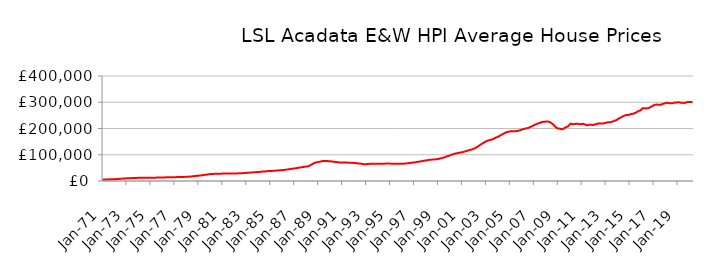
| Category | Series 0 |
|---|---|
| 1971-01-01 | 5721.637 |
| 1971-02-01 | 5762.296 |
| 1971-03-01 | 5803.295 |
| 1971-04-01 | 5856.6 |
| 1971-05-01 | 5945.059 |
| 1971-06-01 | 6037.239 |
| 1971-07-01 | 6150.593 |
| 1971-08-01 | 6273.935 |
| 1971-09-01 | 6396.293 |
| 1971-10-01 | 6523.41 |
| 1971-11-01 | 6660.635 |
| 1971-12-01 | 6827.73 |
| 1972-01-01 | 6943.709 |
| 1972-02-01 | 7019.642 |
| 1972-03-01 | 7192.485 |
| 1972-04-01 | 7434.182 |
| 1972-05-01 | 7783.4 |
| 1972-06-01 | 8089.841 |
| 1972-07-01 | 8442.17 |
| 1972-08-01 | 8782.047 |
| 1972-09-01 | 9082.157 |
| 1972-10-01 | 9362.629 |
| 1972-11-01 | 9622.344 |
| 1972-12-01 | 9890.271 |
| 1973-01-01 | 10081.941 |
| 1973-02-01 | 10217.371 |
| 1973-03-01 | 10373.062 |
| 1973-04-01 | 10550.653 |
| 1973-05-01 | 10778.346 |
| 1973-06-01 | 10926.279 |
| 1973-07-01 | 11081.212 |
| 1973-08-01 | 11253.08 |
| 1973-09-01 | 11453.654 |
| 1973-10-01 | 11661.609 |
| 1973-11-01 | 11820.086 |
| 1973-12-01 | 11933.729 |
| 1974-01-01 | 11994.68 |
| 1974-02-01 | 12060.371 |
| 1974-03-01 | 12057.68 |
| 1974-04-01 | 12031.652 |
| 1974-05-01 | 12008.684 |
| 1974-06-01 | 12009.52 |
| 1974-07-01 | 12021.199 |
| 1974-08-01 | 12060.402 |
| 1974-09-01 | 12131.717 |
| 1974-10-01 | 12219.316 |
| 1974-11-01 | 12291.911 |
| 1974-12-01 | 12363.582 |
| 1975-01-01 | 12396.74 |
| 1975-02-01 | 12438.568 |
| 1975-03-01 | 12512.8 |
| 1975-04-01 | 12618.502 |
| 1975-05-01 | 12746.827 |
| 1975-06-01 | 12815.529 |
| 1975-07-01 | 12882.897 |
| 1975-08-01 | 12975.913 |
| 1975-09-01 | 13101.794 |
| 1975-10-01 | 13241.651 |
| 1975-11-01 | 13364.792 |
| 1975-12-01 | 13496.487 |
| 1976-01-01 | 13589.21 |
| 1976-02-01 | 13676.529 |
| 1976-03-01 | 13736.277 |
| 1976-04-01 | 13799.828 |
| 1976-05-01 | 13882.974 |
| 1976-06-01 | 13937.373 |
| 1976-07-01 | 13997.548 |
| 1976-08-01 | 14086.604 |
| 1976-09-01 | 14214.053 |
| 1976-10-01 | 14357.689 |
| 1976-11-01 | 14472.621 |
| 1976-12-01 | 14575.256 |
| 1977-01-01 | 14632.325 |
| 1977-02-01 | 14697.865 |
| 1977-03-01 | 14740.363 |
| 1977-04-01 | 14790.21 |
| 1977-05-01 | 14867.201 |
| 1977-06-01 | 14937.016 |
| 1977-07-01 | 15022.857 |
| 1977-08-01 | 15140.588 |
| 1977-09-01 | 15284.567 |
| 1977-10-01 | 15446.76 |
| 1977-11-01 | 15618.347 |
| 1977-12-01 | 15842.314 |
| 1978-01-01 | 16008.634 |
| 1978-02-01 | 16138.444 |
| 1978-03-01 | 16313.376 |
| 1978-04-01 | 16548.702 |
| 1978-05-01 | 16925.958 |
| 1978-06-01 | 17307.721 |
| 1978-07-01 | 17769.442 |
| 1978-08-01 | 18243.045 |
| 1978-09-01 | 18698.842 |
| 1978-10-01 | 19152.07 |
| 1978-11-01 | 19574.7 |
| 1978-12-01 | 19992.283 |
| 1979-01-01 | 20240.686 |
| 1979-02-01 | 20407.294 |
| 1979-03-01 | 20822.308 |
| 1979-04-01 | 21391.186 |
| 1979-05-01 | 22117.161 |
| 1979-06-01 | 22577.858 |
| 1979-07-01 | 23056.032 |
| 1979-08-01 | 23594.497 |
| 1979-09-01 | 24239.606 |
| 1979-10-01 | 24928.227 |
| 1979-11-01 | 25501.578 |
| 1979-12-01 | 25947.078 |
| 1980-01-01 | 26191.666 |
| 1980-02-01 | 26381.777 |
| 1980-03-01 | 26625.705 |
| 1980-04-01 | 26911.328 |
| 1980-05-01 | 27245.442 |
| 1980-06-01 | 27424.169 |
| 1980-07-01 | 27586.236 |
| 1980-08-01 | 27736.009 |
| 1980-09-01 | 27841.614 |
| 1980-10-01 | 27909.24 |
| 1980-11-01 | 27961.216 |
| 1980-12-01 | 28071.794 |
| 1981-01-01 | 28137.528 |
| 1981-02-01 | 28237.242 |
| 1981-03-01 | 28337.226 |
| 1981-04-01 | 28471.422 |
| 1981-05-01 | 28607.481 |
| 1981-06-01 | 28653.642 |
| 1981-07-01 | 28675.655 |
| 1981-08-01 | 28681.095 |
| 1981-09-01 | 28627.074 |
| 1981-10-01 | 28528.492 |
| 1981-11-01 | 28437.987 |
| 1981-12-01 | 28428.134 |
| 1982-01-01 | 28384.207 |
| 1982-02-01 | 28403.446 |
| 1982-03-01 | 28560.962 |
| 1982-04-01 | 28826.348 |
| 1982-05-01 | 29123.624 |
| 1982-06-01 | 29232.109 |
| 1982-07-01 | 29313.958 |
| 1982-08-01 | 29470.039 |
| 1982-09-01 | 29723.125 |
| 1982-10-01 | 30023.812 |
| 1982-11-01 | 30323.377 |
| 1982-12-01 | 30694.881 |
| 1983-01-01 | 30977.174 |
| 1983-02-01 | 31219.783 |
| 1983-03-01 | 31472.577 |
| 1983-04-01 | 31785.86 |
| 1983-05-01 | 32196.746 |
| 1983-06-01 | 32519.187 |
| 1983-07-01 | 32870.27 |
| 1983-08-01 | 33203.815 |
| 1983-09-01 | 33470.441 |
| 1983-10-01 | 33688.574 |
| 1983-11-01 | 33894.414 |
| 1983-12-01 | 34164.762 |
| 1984-01-01 | 34326.341 |
| 1984-02-01 | 34490.39 |
| 1984-03-01 | 34801.858 |
| 1984-04-01 | 35233.922 |
| 1984-05-01 | 35728.512 |
| 1984-06-01 | 35947.792 |
| 1984-07-01 | 36131.309 |
| 1984-08-01 | 36410.916 |
| 1984-09-01 | 36857.095 |
| 1984-10-01 | 37373.309 |
| 1984-11-01 | 37772.28 |
| 1984-12-01 | 38049.568 |
| 1985-01-01 | 38126.541 |
| 1985-02-01 | 38232.92 |
| 1985-03-01 | 38494.448 |
| 1985-04-01 | 38861.795 |
| 1985-05-01 | 39281.243 |
| 1985-06-01 | 39443.336 |
| 1985-07-01 | 39593.189 |
| 1985-08-01 | 39852.962 |
| 1985-09-01 | 40286.193 |
| 1985-10-01 | 40780.974 |
| 1985-11-01 | 41196.83 |
| 1985-12-01 | 41529.429 |
| 1986-01-01 | 41658.708 |
| 1986-02-01 | 41790.707 |
| 1986-03-01 | 42176.28 |
| 1986-04-01 | 42734.024 |
| 1986-05-01 | 43430.153 |
| 1986-06-01 | 43851.604 |
| 1986-07-01 | 44282.443 |
| 1986-08-01 | 44796.764 |
| 1986-09-01 | 45443.204 |
| 1986-10-01 | 46141.317 |
| 1986-11-01 | 46774.998 |
| 1986-12-01 | 47365.819 |
| 1987-01-01 | 47708.6 |
| 1987-02-01 | 47992.425 |
| 1987-03-01 | 48608.074 |
| 1987-04-01 | 49436.983 |
| 1987-05-01 | 50427.396 |
| 1987-06-01 | 50986.248 |
| 1987-07-01 | 51520.875 |
| 1987-08-01 | 52109.244 |
| 1987-09-01 | 52747.907 |
| 1987-10-01 | 53409.041 |
| 1987-11-01 | 54028.462 |
| 1987-12-01 | 54670.064 |
| 1988-01-01 | 54975.068 |
| 1988-02-01 | 55238.121 |
| 1988-03-01 | 56158.153 |
| 1988-04-01 | 57542.733 |
| 1988-05-01 | 59626.022 |
| 1988-06-01 | 61728.232 |
| 1988-07-01 | 64203.536 |
| 1988-08-01 | 66480.514 |
| 1988-09-01 | 68233.782 |
| 1988-10-01 | 69689.501 |
| 1988-11-01 | 70860.28 |
| 1988-12-01 | 71899.755 |
| 1989-01-01 | 72443.122 |
| 1989-02-01 | 72902.486 |
| 1989-03-01 | 73682.173 |
| 1989-04-01 | 74674.86 |
| 1989-05-01 | 75726.533 |
| 1989-06-01 | 76186.029 |
| 1989-07-01 | 76498.876 |
| 1989-08-01 | 76645.547 |
| 1989-09-01 | 76519.1 |
| 1989-10-01 | 76165.266 |
| 1989-11-01 | 75694.544 |
| 1989-12-01 | 75310.879 |
| 1990-01-01 | 74965.571 |
| 1990-02-01 | 74951.401 |
| 1990-03-01 | 74436.887 |
| 1990-04-01 | 73769.099 |
| 1990-05-01 | 72988.276 |
| 1990-06-01 | 72615.68 |
| 1990-07-01 | 72298.179 |
| 1990-08-01 | 71988.705 |
| 1990-09-01 | 71553.822 |
| 1990-10-01 | 71056.748 |
| 1990-11-01 | 70595.419 |
| 1990-12-01 | 70399.45 |
| 1991-01-01 | 70261.691 |
| 1991-02-01 | 70335.512 |
| 1991-03-01 | 70223.689 |
| 1991-04-01 | 70149.821 |
| 1991-05-01 | 70052.594 |
| 1991-06-01 | 70009.084 |
| 1991-07-01 | 69962.851 |
| 1991-08-01 | 69897.993 |
| 1991-09-01 | 69786.979 |
| 1991-10-01 | 69588.396 |
| 1991-11-01 | 69263.131 |
| 1991-12-01 | 68919.119 |
| 1992-01-01 | 68578.405 |
| 1992-02-01 | 68526.157 |
| 1992-03-01 | 68048.234 |
| 1992-04-01 | 67471.368 |
| 1992-05-01 | 66834.583 |
| 1992-06-01 | 66626.137 |
| 1992-07-01 | 66476.266 |
| 1992-08-01 | 66161.735 |
| 1992-09-01 | 65490.411 |
| 1992-10-01 | 64657.436 |
| 1992-11-01 | 64092.776 |
| 1992-12-01 | 64109.213 |
| 1993-01-01 | 64267.822 |
| 1993-02-01 | 64548.5 |
| 1993-03-01 | 64800.703 |
| 1993-04-01 | 65116.213 |
| 1993-05-01 | 65385.205 |
| 1993-06-01 | 65415.975 |
| 1993-07-01 | 65435.438 |
| 1993-08-01 | 65489.316 |
| 1993-09-01 | 65448.33 |
| 1993-10-01 | 65330.402 |
| 1993-11-01 | 65253.231 |
| 1993-12-01 | 65481.666 |
| 1994-01-01 | 65795.911 |
| 1994-02-01 | 66187.658 |
| 1994-03-01 | 66172.726 |
| 1994-04-01 | 66012.999 |
| 1994-05-01 | 65872.726 |
| 1994-06-01 | 65885.299 |
| 1994-07-01 | 65964.465 |
| 1994-08-01 | 66127.292 |
| 1994-09-01 | 66386.103 |
| 1994-10-01 | 66699.652 |
| 1994-11-01 | 66848.045 |
| 1994-12-01 | 66760.501 |
| 1995-01-01 | 66271.317 |
| 1995-02-01 | 65850.218 |
| 1995-03-01 | 65691.881 |
| 1995-04-01 | 65526.898 |
| 1995-05-01 | 65554.846 |
| 1995-06-01 | 65415.772 |
| 1995-07-01 | 65558.368 |
| 1995-08-01 | 65621.703 |
| 1995-09-01 | 65659.154 |
| 1995-10-01 | 65635.619 |
| 1995-11-01 | 65718.381 |
| 1995-12-01 | 65799.005 |
| 1996-01-01 | 65822.874 |
| 1996-02-01 | 65782.824 |
| 1996-03-01 | 66000.184 |
| 1996-04-01 | 66256.695 |
| 1996-05-01 | 66744.04 |
| 1996-06-01 | 67100.794 |
| 1996-07-01 | 67683.378 |
| 1996-08-01 | 68247.062 |
| 1996-09-01 | 68816.57 |
| 1996-10-01 | 69231.247 |
| 1996-11-01 | 69670.904 |
| 1996-12-01 | 70292.598 |
| 1997-01-01 | 70738.527 |
| 1997-02-01 | 71213.588 |
| 1997-03-01 | 71619.33 |
| 1997-04-01 | 72277.827 |
| 1997-05-01 | 73137.953 |
| 1997-06-01 | 73791.083 |
| 1997-07-01 | 74252.184 |
| 1997-08-01 | 74987.177 |
| 1997-09-01 | 75644.772 |
| 1997-10-01 | 76496.497 |
| 1997-11-01 | 77092.068 |
| 1997-12-01 | 77848.446 |
| 1998-01-01 | 78297.188 |
| 1998-02-01 | 78971.066 |
| 1998-03-01 | 79558.894 |
| 1998-04-01 | 80288.676 |
| 1998-05-01 | 80807.089 |
| 1998-06-01 | 81125.572 |
| 1998-07-01 | 81506.943 |
| 1998-08-01 | 81863.791 |
| 1998-09-01 | 82224.992 |
| 1998-10-01 | 82464.657 |
| 1998-11-01 | 82744.276 |
| 1998-12-01 | 83080.436 |
| 1999-01-01 | 83577.993 |
| 1999-02-01 | 84571.705 |
| 1999-03-01 | 85447.682 |
| 1999-04-01 | 86316.681 |
| 1999-05-01 | 87268.309 |
| 1999-06-01 | 88275.026 |
| 1999-07-01 | 89460.227 |
| 1999-08-01 | 90994.233 |
| 1999-09-01 | 92557.97 |
| 1999-10-01 | 93994.71 |
| 1999-11-01 | 94970.284 |
| 1999-12-01 | 96280.655 |
| 2000-01-01 | 97325.701 |
| 2000-02-01 | 99209.663 |
| 2000-03-01 | 100688.495 |
| 2000-04-01 | 102265.077 |
| 2000-05-01 | 103063.262 |
| 2000-06-01 | 104041.767 |
| 2000-07-01 | 104914.739 |
| 2000-08-01 | 105728.177 |
| 2000-09-01 | 106483.482 |
| 2000-10-01 | 107259.346 |
| 2000-11-01 | 107898.373 |
| 2000-12-01 | 108711.995 |
| 2001-01-01 | 109371.114 |
| 2001-02-01 | 110393.728 |
| 2001-03-01 | 111350.355 |
| 2001-04-01 | 112525.531 |
| 2001-05-01 | 113793.316 |
| 2001-06-01 | 114844.266 |
| 2001-07-01 | 115990.605 |
| 2001-08-01 | 117133.207 |
| 2001-09-01 | 118167.979 |
| 2001-10-01 | 118862.601 |
| 2001-11-01 | 120047.789 |
| 2001-12-01 | 121360.722 |
| 2002-01-01 | 123114.809 |
| 2002-02-01 | 124819.005 |
| 2002-03-01 | 126855.333 |
| 2002-04-01 | 129047.909 |
| 2002-05-01 | 131523.479 |
| 2002-06-01 | 134030.721 |
| 2002-07-01 | 136776.102 |
| 2002-08-01 | 139215.035 |
| 2002-09-01 | 141803.563 |
| 2002-10-01 | 144227.825 |
| 2002-11-01 | 146357.451 |
| 2002-12-01 | 148702.365 |
| 2003-01-01 | 150794.009 |
| 2003-02-01 | 152510.864 |
| 2003-03-01 | 153898.607 |
| 2003-04-01 | 155226.269 |
| 2003-05-01 | 156353.205 |
| 2003-06-01 | 157259.237 |
| 2003-07-01 | 158057.815 |
| 2003-08-01 | 159627.899 |
| 2003-09-01 | 161267.535 |
| 2003-10-01 | 163410.624 |
| 2003-11-01 | 165491.163 |
| 2003-12-01 | 167233.597 |
| 2004-01-01 | 167957.067 |
| 2004-02-01 | 170238.124 |
| 2004-03-01 | 172480.568 |
| 2004-04-01 | 174513.653 |
| 2004-05-01 | 176743.804 |
| 2004-06-01 | 178895.701 |
| 2004-07-01 | 180975.64 |
| 2004-08-01 | 183049.298 |
| 2004-09-01 | 184672.192 |
| 2004-10-01 | 186320.382 |
| 2004-11-01 | 187184.644 |
| 2004-12-01 | 188206.909 |
| 2005-01-01 | 189021.112 |
| 2005-02-01 | 190183.952 |
| 2005-03-01 | 190005.817 |
| 2005-04-01 | 190071.875 |
| 2005-05-01 | 189485.539 |
| 2005-06-01 | 190073.366 |
| 2005-07-01 | 190099.846 |
| 2005-08-01 | 190409.416 |
| 2005-09-01 | 191025.705 |
| 2005-10-01 | 192128.229 |
| 2005-11-01 | 193022.749 |
| 2005-12-01 | 194589.472 |
| 2006-01-01 | 195561.889 |
| 2006-02-01 | 197180.233 |
| 2006-03-01 | 198290.018 |
| 2006-04-01 | 199521.21 |
| 2006-05-01 | 200291.878 |
| 2006-06-01 | 200874.24 |
| 2006-07-01 | 201753.772 |
| 2006-08-01 | 202945.476 |
| 2006-09-01 | 204665.909 |
| 2006-10-01 | 206669.853 |
| 2006-11-01 | 208271.992 |
| 2006-12-01 | 210431.706 |
| 2007-01-01 | 212236.573 |
| 2007-02-01 | 214691.924 |
| 2007-03-01 | 215960.598 |
| 2007-04-01 | 217668.208 |
| 2007-05-01 | 218745.526 |
| 2007-06-01 | 220436.757 |
| 2007-07-01 | 221128.98 |
| 2007-08-01 | 222903.284 |
| 2007-09-01 | 224639.27 |
| 2007-10-01 | 225909.983 |
| 2007-11-01 | 225637.65 |
| 2007-12-01 | 225795.991 |
| 2008-01-01 | 226230.744 |
| 2008-02-01 | 227150.677 |
| 2008-03-01 | 226536.237 |
| 2008-04-01 | 226088.749 |
| 2008-05-01 | 224583.894 |
| 2008-06-01 | 222870.934 |
| 2008-07-01 | 219624.904 |
| 2008-08-01 | 216697.269 |
| 2008-09-01 | 213087.292 |
| 2008-10-01 | 209193.305 |
| 2008-11-01 | 204692.274 |
| 2008-12-01 | 201599.231 |
| 2009-01-01 | 200403.32 |
| 2009-02-01 | 201116.809 |
| 2009-03-01 | 199383.582 |
| 2009-04-01 | 198315.606 |
| 2009-05-01 | 196756.715 |
| 2009-06-01 | 198255.489 |
| 2009-07-01 | 199781.16 |
| 2009-08-01 | 202057.625 |
| 2009-09-01 | 204651.712 |
| 2009-10-01 | 206995.738 |
| 2009-11-01 | 207417.779 |
| 2009-12-01 | 211553.202 |
| 2010-01-01 | 214802.067 |
| 2010-02-01 | 218402.314 |
| 2010-03-01 | 216980.15 |
| 2010-04-01 | 216236.552 |
| 2010-05-01 | 216342.245 |
| 2010-06-01 | 217108.95 |
| 2010-07-01 | 217722.397 |
| 2010-08-01 | 218424.805 |
| 2010-09-01 | 218322.566 |
| 2010-10-01 | 217469.066 |
| 2010-11-01 | 215945.135 |
| 2010-12-01 | 216018.582 |
| 2011-01-01 | 216546.568 |
| 2011-02-01 | 218068.153 |
| 2011-03-01 | 218196.649 |
| 2011-04-01 | 216131.402 |
| 2011-05-01 | 213449.47 |
| 2011-06-01 | 211977.123 |
| 2011-07-01 | 212947.067 |
| 2011-08-01 | 214410.19 |
| 2011-09-01 | 214360.747 |
| 2011-10-01 | 214614.218 |
| 2011-11-01 | 213368.423 |
| 2011-12-01 | 213453.491 |
| 2012-01-01 | 214164.256 |
| 2012-02-01 | 214959.421 |
| 2012-03-01 | 216756.933 |
| 2012-04-01 | 217525.251 |
| 2012-05-01 | 219534.588 |
| 2012-06-01 | 219513.993 |
| 2012-07-01 | 219293.182 |
| 2012-08-01 | 218806.749 |
| 2012-09-01 | 219040.471 |
| 2012-10-01 | 219439.904 |
| 2012-11-01 | 219547.943 |
| 2012-12-01 | 220234.493 |
| 2013-01-01 | 220907.865 |
| 2013-02-01 | 222701.635 |
| 2013-03-01 | 223469.687 |
| 2013-04-01 | 224076.303 |
| 2013-05-01 | 223921.625 |
| 2013-06-01 | 224267.124 |
| 2013-07-01 | 225135.999 |
| 2013-08-01 | 226546.907 |
| 2013-09-01 | 227936.906 |
| 2013-10-01 | 229322.843 |
| 2013-11-01 | 230315.56 |
| 2013-12-01 | 232460.97 |
| 2014-01-01 | 235647.935 |
| 2014-02-01 | 237927.871 |
| 2014-03-01 | 240195.48 |
| 2014-04-01 | 241469.41 |
| 2014-05-01 | 243828.789 |
| 2014-06-01 | 245878.968 |
| 2014-07-01 | 247539.081 |
| 2014-08-01 | 249418.581 |
| 2014-09-01 | 250747.668 |
| 2014-10-01 | 251554.885 |
| 2014-11-01 | 251534.53 |
| 2014-12-01 | 251925.861 |
| 2015-01-01 | 253431.809 |
| 2015-02-01 | 254648.094 |
| 2015-03-01 | 255340.043 |
| 2015-04-01 | 255876.646 |
| 2015-05-01 | 257025.996 |
| 2015-06-01 | 258406.622 |
| 2015-07-01 | 259602.635 |
| 2015-08-01 | 262060.066 |
| 2015-09-01 | 264071.331 |
| 2015-10-01 | 266782.334 |
| 2015-11-01 | 267291.861 |
| 2015-12-01 | 269274.759 |
| 2016-01-01 | 271443.4 |
| 2016-02-01 | 277004.369 |
| 2016-03-01 | 277389.465 |
| 2016-04-01 | 277297.091 |
| 2016-05-01 | 275418.62 |
| 2016-06-01 | 276421.502 |
| 2016-07-01 | 276889.319 |
| 2016-08-01 | 277720.279 |
| 2016-09-01 | 279478.836 |
| 2016-10-01 | 282129.038 |
| 2016-11-01 | 283867.789 |
| 2016-12-01 | 285994.373 |
| 2017-01-01 | 288305.174 |
| 2017-02-01 | 290047.786 |
| 2017-03-01 | 291500.755 |
| 2017-04-01 | 291264.163 |
| 2017-05-01 | 291153.386 |
| 2017-06-01 | 290026.535 |
| 2017-07-01 | 289885.181 |
| 2017-08-01 | 290351.528 |
| 2017-09-01 | 292184.806 |
| 2017-10-01 | 293542.539 |
| 2017-11-01 | 294658.844 |
| 2017-12-01 | 295560.962 |
| 2018-01-01 | 297174.388 |
| 2018-02-01 | 298313.44 |
| 2018-03-01 | 297460.703 |
| 2018-04-01 | 296660.349 |
| 2018-05-01 | 295704.696 |
| 2018-06-01 | 296136.927 |
| 2018-07-01 | 295042.264 |
| 2018-08-01 | 295883.669 |
| 2018-09-01 | 296762.15 |
| 2018-10-01 | 298734.437 |
| 2018-11-01 | 297922.604 |
| 2018-12-01 | 298476.442 |
| 2019-01-01 | 299007.371 |
| 2019-02-01 | 300296.096 |
| 2019-03-01 | 299241.98 |
| 2019-04-01 | 298500.906 |
| 2019-05-01 | 298354.748 |
| 2019-06-01 | 298327.607 |
| 2019-07-01 | 297294.31 |
| 2019-08-01 | 296954.896 |
| 2019-09-01 | 298124.388 |
| 2019-10-01 | 300044.888 |
| 2019-11-01 | 300830.748 |
| 2019-12-01 | 301113.507 |
| 2020-01-01 | 300626.774 |
| 2020-02-01 | 301243.459 |
| 2020-03-01 | 300819.281 |
| 2020-04-01 | 301270.184 |